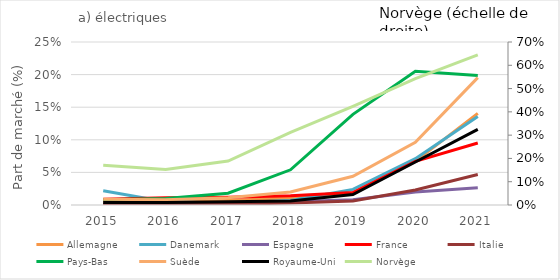
| Category | Allemagne | Danemark | Espagne | France | Italie  | Pays-Bas | Suède | Royaume-Uni |
|---|---|---|---|---|---|---|---|---|
| 2015.0 | 0.004 | 0.022 | 0.001 | 0.009 | 0.001 | 0.008 | 0.009 | 0.004 |
| 2016.0 | 0.004 | 0.005 | 0.002 | 0.011 | 0.001 | 0.01 | 0.008 | 0.004 |
| 2017.0 | 0.007 | 0.003 | 0.003 | 0.012 | 0.001 | 0.018 | 0.011 | 0.005 |
| 2018.0 | 0.011 | 0.007 | 0.005 | 0.014 | 0.003 | 0.054 | 0.02 | 0.006 |
| 2019.0 | 0.018 | 0.024 | 0.008 | 0.019 | 0.006 | 0.139 | 0.044 | 0.016 |
| 2020.0 | 0.067 | 0.071 | 0.02 | 0.067 | 0.023 | 0.205 | 0.096 | 0.066 |
| 2021.0 | 0.14 | 0.136 | 0.026 | 0.095 | 0.047 | 0.199 | 0.195 | 0.116 |